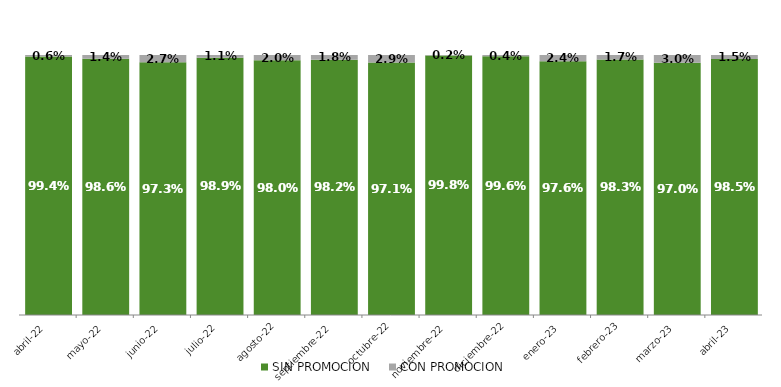
| Category | SIN PROMOCION   | CON PROMOCION   |
|---|---|---|
| 2022-04-01 | 0.994 | 0.006 |
| 2022-05-01 | 0.986 | 0.014 |
| 2022-06-01 | 0.973 | 0.027 |
| 2022-07-01 | 0.989 | 0.011 |
| 2022-08-01 | 0.98 | 0.02 |
| 2022-09-01 | 0.982 | 0.018 |
| 2022-10-01 | 0.971 | 0.029 |
| 2022-11-01 | 0.998 | 0.002 |
| 2022-12-01 | 0.996 | 0.004 |
| 2023-01-01 | 0.976 | 0.024 |
| 2023-02-01 | 0.983 | 0.017 |
| 2023-03-01 | 0.97 | 0.03 |
| 2023-04-01 | 0.985 | 0.015 |